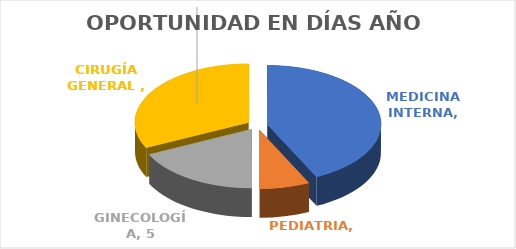
| Category | OPORTUNIDAD EN DÍAS AÑO 2019 |
|---|---|
| MEDICINA INTERNA | 12 |
| PEDIATRIA | 2 |
| GINECOLOGÍA | 5 |
| CIRUGÍA GENERAL  | 9 |